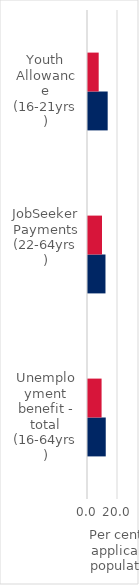
| Category | Jun2020 | Jun2021 |
|---|---|---|
| Unemployment benefit - total (16-64yrs) | 11.829 | 9.055 |
| JobSeeker Payments (22-64yrs) | 11.652 | 9.329 |
| Youth Allowance (16-21yrs) | 13.119 | 7.127 |